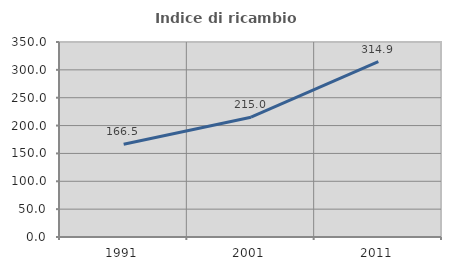
| Category | Indice di ricambio occupazionale  |
|---|---|
| 1991.0 | 166.489 |
| 2001.0 | 214.97 |
| 2011.0 | 314.857 |